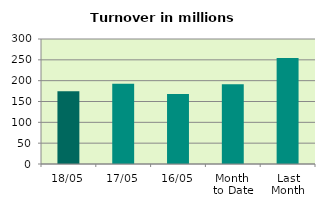
| Category | Series 0 |
|---|---|
| 18/05 | 174.328 |
| 17/05 | 192.616 |
| 16/05 | 167.877 |
| Month 
to Date | 191.237 |
| Last
Month | 254.458 |